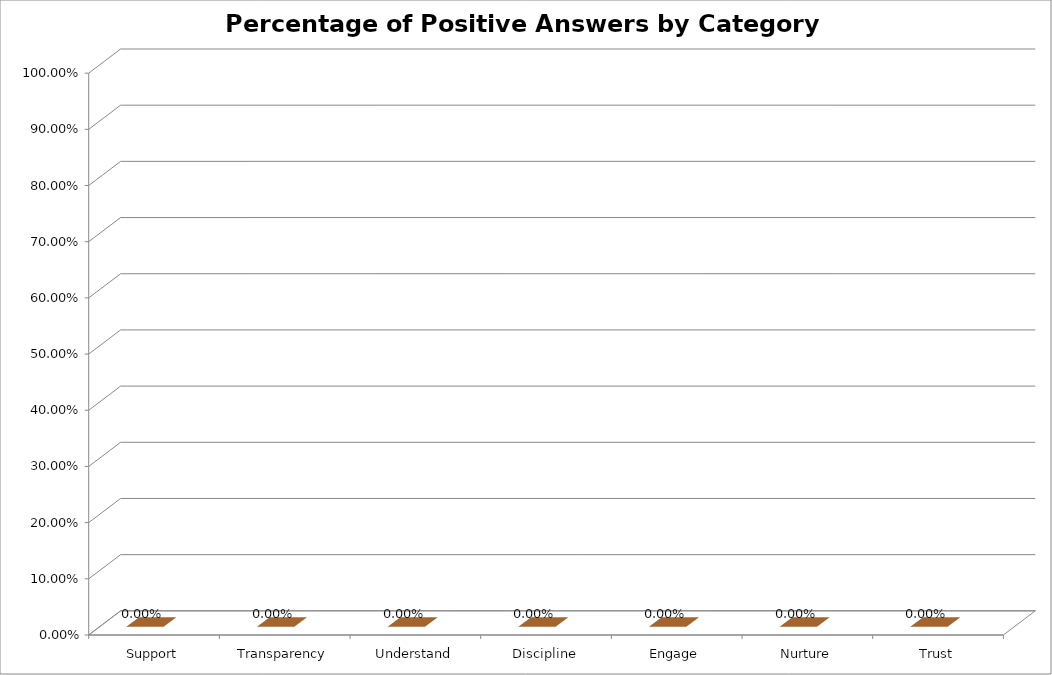
| Category | Series 0 | Series 1 |
|---|---|---|
| Support | 0 |  |
| Transparency | 0 |  |
| Understand | 0 |  |
| Discipline | 0 |  |
| Engage | 0 |  |
| Nurture | 0 |  |
| Trust | 0 |  |